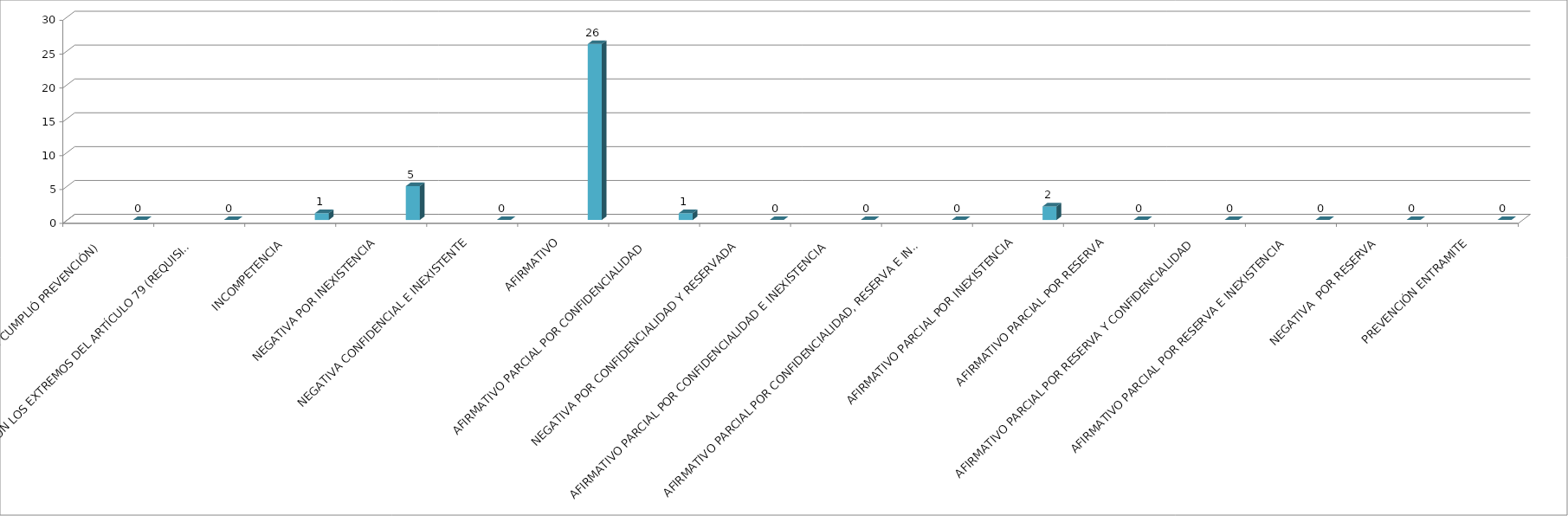
| Category | Series 0 | Series 1 | Series 2 | Series 3 | Series 4 |
|---|---|---|---|---|---|
| SE TIENE POR NO PRESENTADA ( NO CUMPLIÓ PREVENCIÓN) |  |  |  |  | 0 |
| NO CUMPLIO CON LOS EXTREMOS DEL ARTÍCULO 79 (REQUISITOS) |  |  |  |  | 0 |
| INCOMPETENCIA  |  |  |  |  | 1 |
| NEGATIVA POR INEXISTENCIA |  |  |  |  | 5 |
| NEGATIVA CONFIDENCIAL E INEXISTENTE |  |  |  |  | 0 |
| AFIRMATIVO |  |  |  |  | 26 |
| AFIRMATIVO PARCIAL POR CONFIDENCIALIDAD  |  |  |  |  | 1 |
| NEGATIVA POR CONFIDENCIALIDAD Y RESERVADA |  |  |  |  | 0 |
| AFIRMATIVO PARCIAL POR CONFIDENCIALIDAD E INEXISTENCIA |  |  |  |  | 0 |
| AFIRMATIVO PARCIAL POR CONFIDENCIALIDAD, RESERVA E INEXISTENCIA |  |  |  |  | 0 |
| AFIRMATIVO PARCIAL POR INEXISTENCIA |  |  |  |  | 2 |
| AFIRMATIVO PARCIAL POR RESERVA |  |  |  |  | 0 |
| AFIRMATIVO PARCIAL POR RESERVA Y CONFIDENCIALIDAD |  |  |  |  | 0 |
| AFIRMATIVO PARCIAL POR RESERVA E INEXISTENCIA |  |  |  |  | 0 |
| NEGATIVA  POR RESERVA |  |  |  |  | 0 |
| PREVENCIÓN ENTRAMITE |  |  |  |  | 0 |